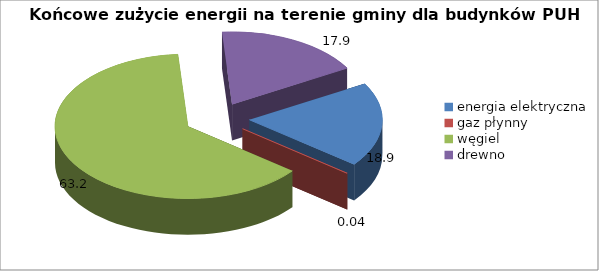
| Category | 18,9 0,04 63,2 17,9 |
|---|---|
| energia elektryczna | 18.886 |
| gaz płynny | 0.035 |
| węgiel | 63.204 |
| drewno | 17.874 |